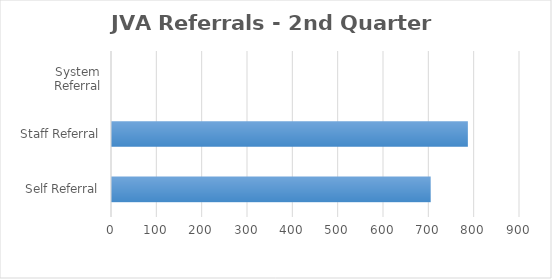
| Category | Series 0 |
|---|---|
| Self Referral | 703 |
| Staff Referral | 785 |
| System Referral | 0 |